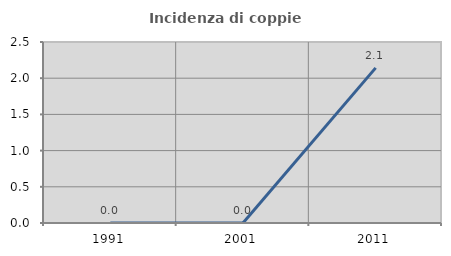
| Category | Incidenza di coppie miste |
|---|---|
| 1991.0 | 0 |
| 2001.0 | 0 |
| 2011.0 | 2.143 |